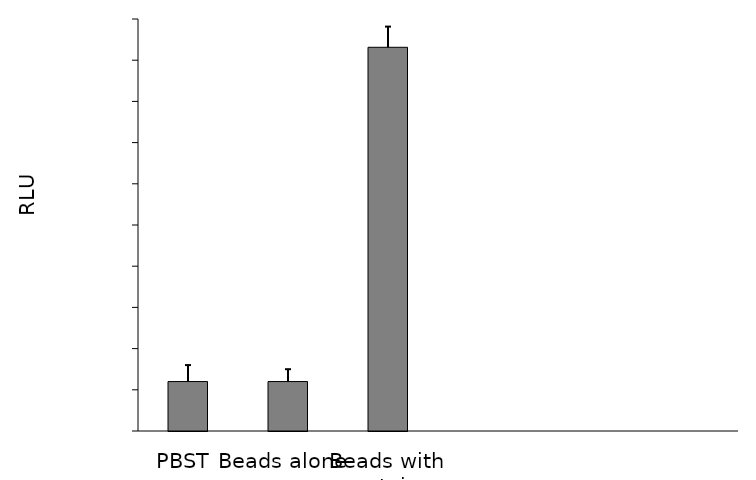
| Category | Series 0 |
|---|---|
| PBST | 12 |
| Beads alone | 12 |
| Beads with proteins | 93.135 |